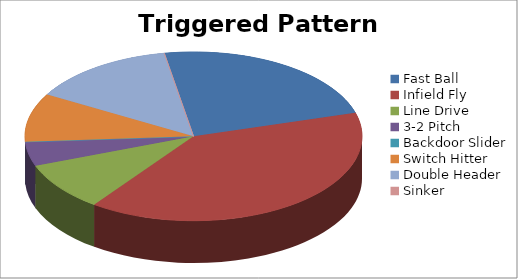
| Category | Series 1 |
|---|---|
| Fast Ball | 10 |
| Infield Fly | 17 |
| Line Drive | 4 |
| 3-2 Pitch | 2 |
| Backdoor Slider | 0 |
| Switch Hitter | 4 |
| Double Header | 6 |
| Sinker | 0 |